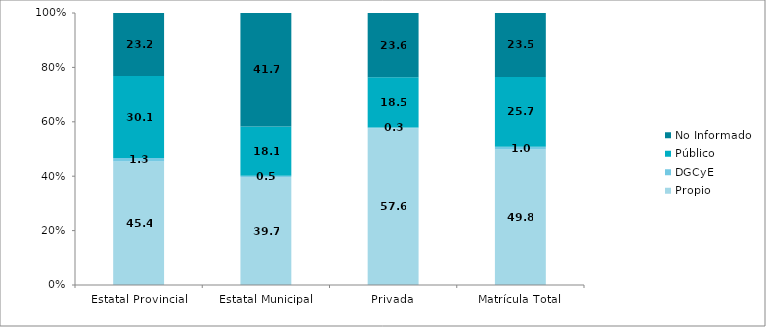
| Category | Propio | DGCyE | Público | No Informado |
|---|---|---|---|---|
| Estatal Provincial | 45.4 | 1.3 | 30.1 | 23.2 |
| Estatal Municipal | 39.7 | 0.5 | 18.1 | 41.7 |
| Privada | 57.6 | 0.3 | 18.5 | 23.6 |
| Matrícula Total | 49.8 | 1 | 25.7 | 23.5 |